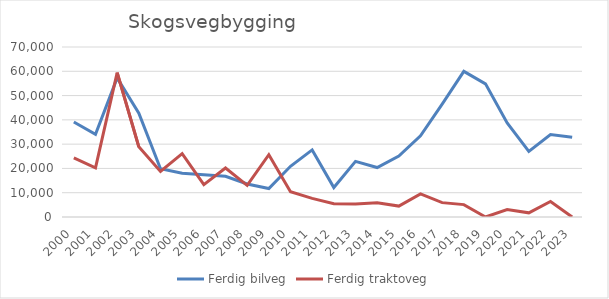
| Category | Ferdig bilveg | Ferdig traktoveg |
|---|---|---|
| 2000.0 | 39123 | 24311 |
| 2001.0 | 34021 | 20203 |
| 2002.0 | 57267 | 59477 |
| 2003.0 | 42714 | 28887 |
| 2004.0 | 19885 | 18730 |
| 2005.0 | 18053 | 26087 |
| 2006.0 | 17403 | 13316 |
| 2007.0 | 16772 | 20187 |
| 2008.0 | 13590 | 13050 |
| 2009.0 | 11710 | 25640 |
| 2010.0 | 20889 | 10400 |
| 2011.0 | 27636 | 7650 |
| 2012.0 | 12120 | 5475 |
| 2013.0 | 22914 | 5350 |
| 2014.0 | 20371 | 5850 |
| 2015.0 | 25101 | 4500 |
| 2016.0 | 33467 | 9510 |
| 2017.0 | 46517 | 5919 |
| 2018.0 | 59969 | 5105 |
| 2019.0 | 54825 | 0 |
| 2020.0 | 38741 | 3080 |
| 2021.0 | 27037 | 1720 |
| 2022.0 | 33955 | 6367 |
| 2023.0 | 32884 | 0 |